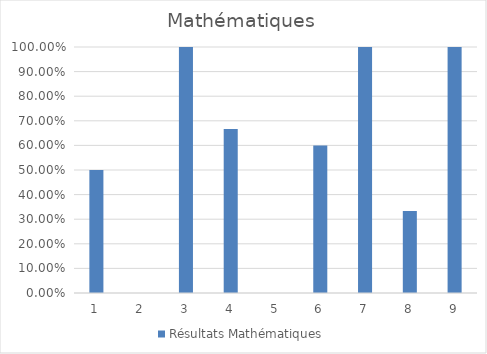
| Category | Résultats Mathématiques |
|---|---|
| 0 | 0.5 |
| 1 | 0 |
| 2 | 1 |
| 3 | 0.667 |
| 4 | 0 |
| 5 | 0.6 |
| 6 | 1 |
| 7 | 0.333 |
| 8 | 1 |